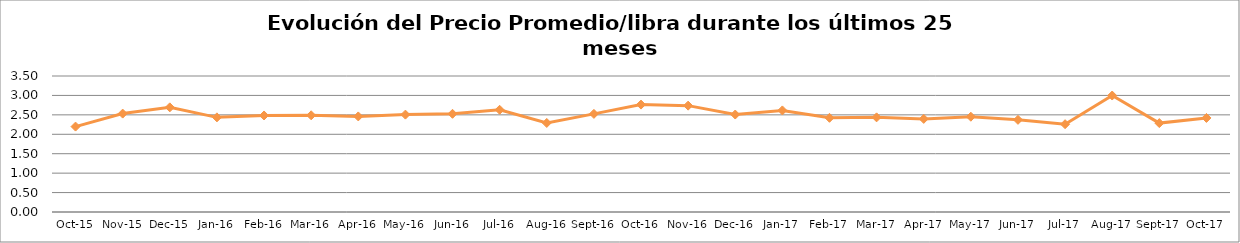
| Category | Series 0 |
|---|---|
| 2015-10-01 | 2.198 |
| 2015-11-01 | 2.532 |
| 2015-12-01 | 2.693 |
| 2016-01-01 | 2.436 |
| 2016-02-01 | 2.484 |
| 2016-03-01 | 2.488 |
| 2016-04-01 | 2.46 |
| 2016-05-01 | 2.506 |
| 2016-06-01 | 2.527 |
| 2016-07-01 | 2.631 |
| 2016-08-01 | 2.292 |
| 2016-09-01 | 2.525 |
| 2016-10-01 | 2.764 |
| 2016-11-01 | 2.737 |
| 2016-12-01 | 2.508 |
| 2017-01-01 | 2.615 |
| 2017-02-01 | 2.424 |
| 2017-03-01 | 2.436 |
| 2017-04-01 | 2.396 |
| 2017-05-01 | 2.452 |
| 2017-06-01 | 2.372 |
| 2017-07-01 | 2.26 |
| 2017-08-01 | 2.997 |
| 2017-09-01 | 2.288 |
| 2017-10-01 | 2.421 |